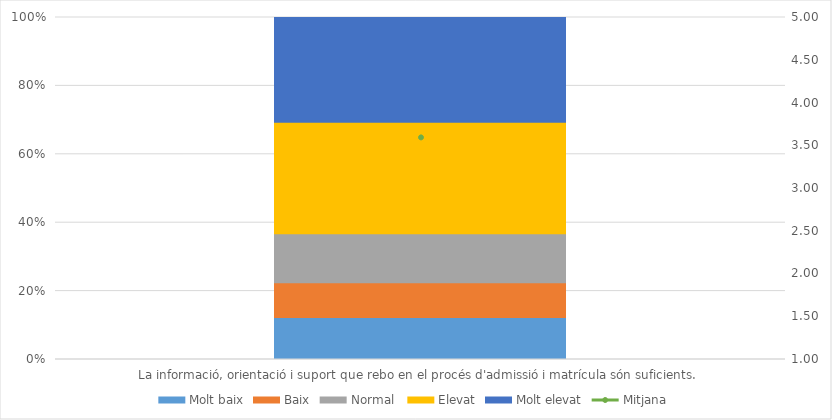
| Category | Molt baix | Baix | Normal  | Elevat | Molt elevat |
|---|---|---|---|---|---|
| La informació, orientació i suport que rebo en el procés d'admissió i matrícula són suficients. | 6 | 5 | 7 | 16 | 15 |